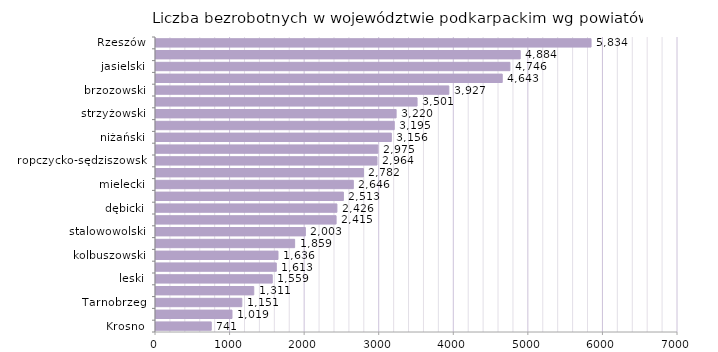
| Category | Liczba bezrobotnych w województwie podkarpackim wg powiatów |
|---|---|
| Krosno | 741 |
| bieszczadzki | 1019 |
| Tarnobrzeg | 1151 |
| tarnobrzeski  | 1311 |
| leski | 1559 |
| lubaczowski | 1613 |
| kolbuszowski | 1636 |
| krośnieński | 1859 |
| stalowowolski | 2003 |
| sanocki | 2415 |
| dębicki | 2426 |
| Przemyśl | 2513 |
| mielecki | 2646 |
| łańcucki | 2782 |
| ropczycko-sędziszowski | 2964 |
| przemyski | 2975 |
| niżański | 3156 |
| leżajski | 3195 |
| strzyżowski | 3220 |
| przeworski | 3501 |
| brzozowski | 3927 |
| jarosławski | 4643 |
| jasielski | 4746 |
| rzeszowski | 4884 |
| Rzeszów | 5834 |